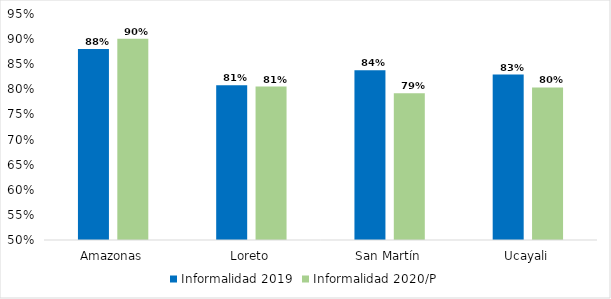
| Category | Informalidad 2019 | Informalidad 2020/P |
|---|---|---|
| Amazonas | 0.881 | 0.901 |
| Loreto | 0.808 | 0.806 |
| San Martín | 0.838 | 0.792 |
| Ucayali | 0.829 | 0.804 |